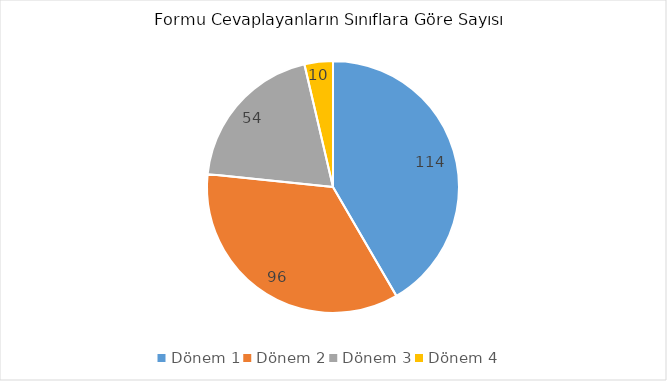
| Category | Formu Cevaplayanlar |
|---|---|
| Dönem 1 | 114 |
| Dönem 2 | 96 |
| Dönem 3 | 54 |
| Dönem 4 | 10 |